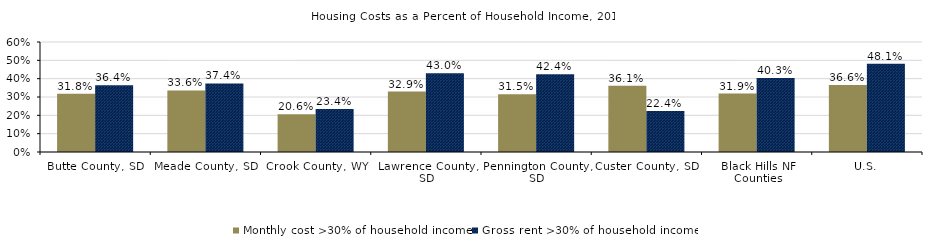
| Category | Monthly cost >30% of household income | Gross rent >30% of household income |
|---|---|---|
| Gallatin County, MT | 0.375 | 0.442 |
| County Region | 0.375 | 0.442 |
| U.S. | 0.366 | 0.481 |